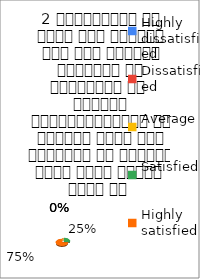
| Category | 2 व्याख्यान से रूचि में वृद्धि हुई एवं शिक्षण जानकारी से परिपूर्ण था 
शिक्षक विद्यार्थियों के द्वारा पूछे गये प्रश्नो का समाधान करने हेतु तत्पर  रहते है  |
|---|---|
| Highly dissatisfied | 0 |
| Dissatisfied | 0 |
| Average | 0 |
| Satisfied | 2 |
| Highly satisfied | 6 |